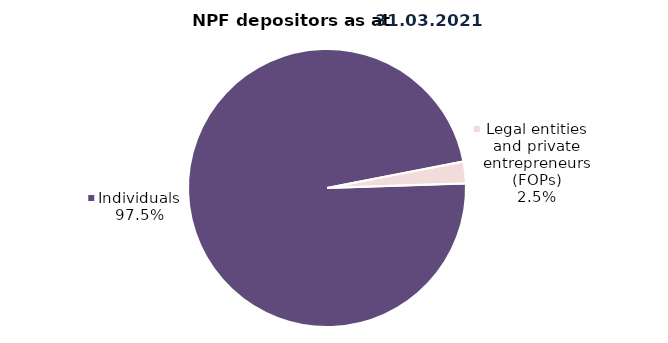
| Category | Series 0 |
|---|---|
| Legal entities and private entrepreneurs (FOPs) | 2059 |
| Individuals | 79358 |